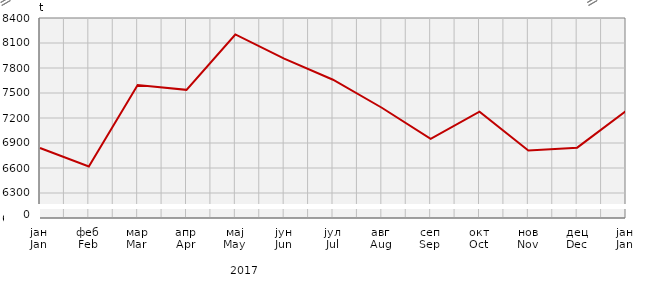
| Category | Прикупљање крављег млијека
Collecting of cow’s milk |
|---|---|
| јан
Jan | 6839.677 |
| феб
Feb | 6618.5 |
| мар
Mar | 7595.98 |
| апр
Apr | 7537.768 |
| мај
May | 8202.4 |
| јун
Jun | 7912.4 |
| јул
Jul | 7659 |
| авг
Aug | 7323 |
| сеп
Sep | 6949.6 |
| окт
Oct | 7275 |
| нов
Nov | 6810.8 |
| дец
Dec | 6844 |
| јан
Jan | 7283.5 |